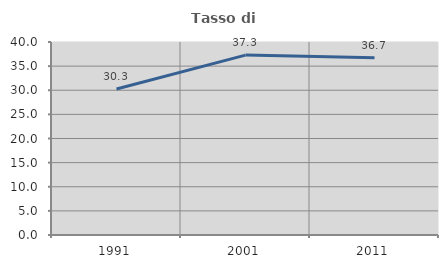
| Category | Tasso di occupazione   |
|---|---|
| 1991.0 | 30.263 |
| 2001.0 | 37.288 |
| 2011.0 | 36.735 |